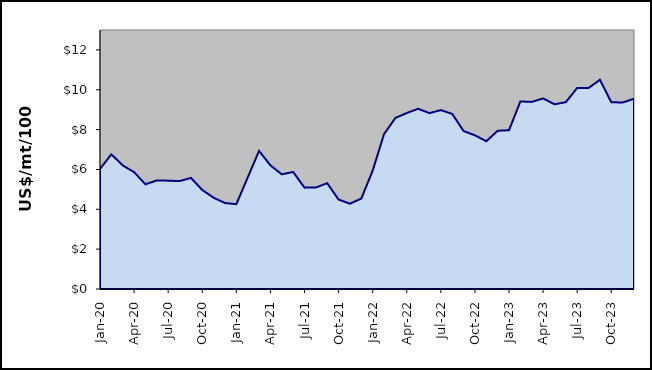
| Category | Series 0 |
|---|---|
| 2020-01-01 | 6.027 |
| 2020-02-01 | 6.76 |
| 2020-03-01 | 6.204 |
| 2020-04-01 | 5.864 |
| 2020-05-01 | 5.255 |
| 2020-06-01 | 5.45 |
| 2020-07-01 | 5.438 |
| 2020-08-01 | 5.415 |
| 2020-09-01 | 5.577 |
| 2020-10-01 | 4.972 |
| 2020-11-01 | 4.58 |
| 2020-12-01 | 4.315 |
| 2021-01-01 | 4.258 |
| 2021-02-01 | 5.598 |
| 2021-03-01 | 6.932 |
| 2021-04-01 | 6.205 |
| 2021-05-01 | 5.756 |
| 2021-06-01 | 5.872 |
| 2021-07-01 | 5.088 |
| 2021-08-01 | 5.094 |
| 2021-09-01 | 5.31 |
| 2021-10-01 | 4.488 |
| 2021-11-01 | 4.281 |
| 2021-12-01 | 4.54 |
| 2022-01-01 | 5.942 |
| 2022-02-01 | 7.775 |
| 2022-03-01 | 8.585 |
| 2022-04-01 | 8.834 |
| 2022-05-01 | 9.046 |
| 2022-06-01 | 8.829 |
| 2022-07-01 | 8.979 |
| 2022-08-01 | 8.79 |
| 2022-09-01 | 7.929 |
| 2022-10-01 | 7.714 |
| 2022-11-01 | 7.416 |
| 2022-12-01 | 7.941 |
| 2023-01-01 | 7.97 |
| 2023-02-01 | 9.414 |
| 2023-03-01 | 9.39 |
| 2023-04-01 | 9.567 |
| 2023-05-01 | 9.272 |
| 2023-06-01 | 9.377 |
| 2023-07-01 | 10.092 |
| 2023-08-01 | 10.091 |
| 2023-09-01 | 10.501 |
| 2023-10-01 | 9.378 |
| 2023-11-01 | 9.358 |
| 2023-12-01 | 9.549 |